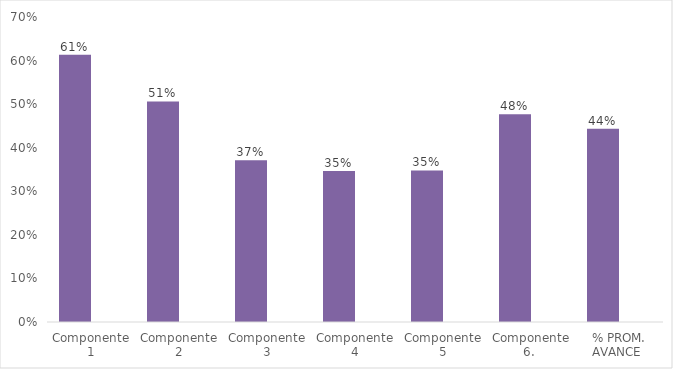
| Category | enero-abril  | mayo - agosto  | septiembre-diciembre |
|---|---|---|---|
| Componente 1 | 0.613 |  | 0 |
| Componente 2 | 0.506 |  | 0 |
| Componente 3 | 0.371 |  | 0 |
| Componente 4 | 0.347 |  | 0 |
| Componente 5 | 0.348 |  | 0 |
| Componente 6.  | 0.477 |  | 0 |
| % PROM. AVANCE  | 0.444 |  | 0 |